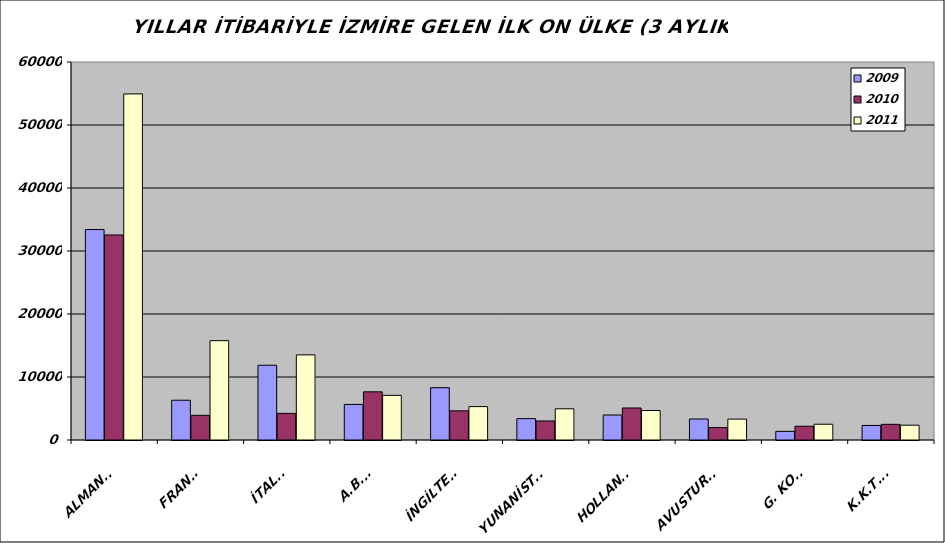
| Category | 2009 | 2010 | 2011 |
|---|---|---|---|
| ALMANYA | 33404 | 32546 | 54931 |
| FRANSA | 6312 | 3913 | 15764 |
| İTALYA | 11868 | 4224 | 13510 |
| A.B.D. | 5645 | 7648 | 7085 |
| İNGİLTERE | 8303 | 4631 | 5298 |
| YUNANİSTAN | 3391 | 3023 | 4952 |
| HOLLANDA | 3967 | 5082 | 4678 |
| AVUSTURYA | 3329 | 1969 | 3315 |
| G. KORE | 1369 | 2182 | 2503 |
| K.K.T.C. | 2307 | 2487 | 2351 |